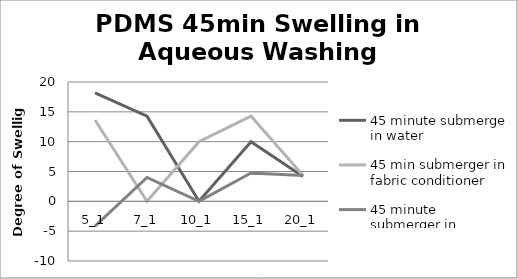
| Category | 45 minute submerge in water | 45 min submerger in fabric conditioner | 45 minute submerger in detergent |
|---|---|---|---|
| 5_1 | 18.182 | 13.636 | -4.167 |
| 7_1 | 14.286 | 0 | 4 |
| 10_1 | 0 | 10 | 0 |
| 15_1 | 10 | 14.286 | 4.762 |
| 20_1 | 4.167 | 4.348 | 4.348 |